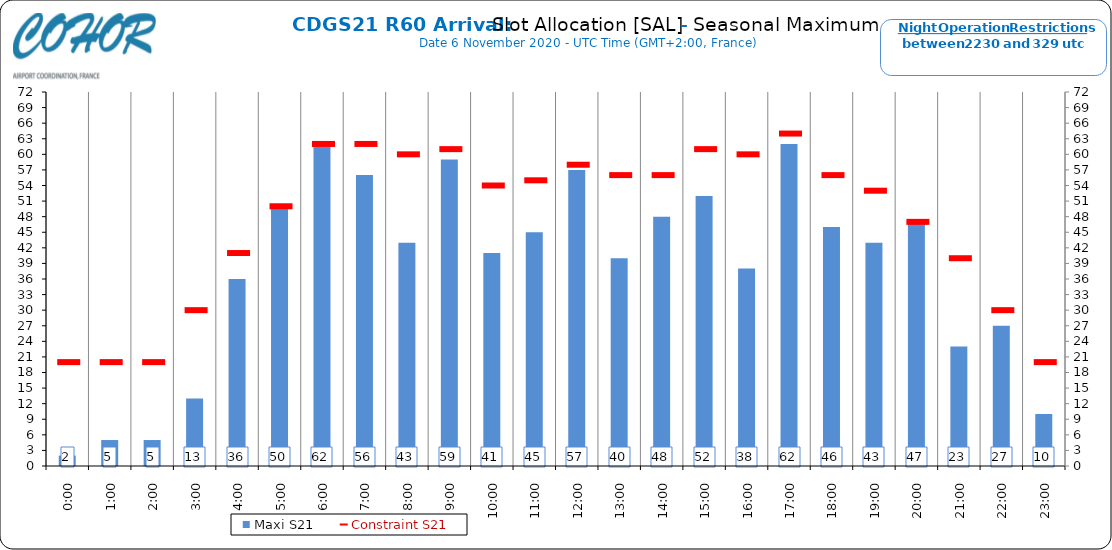
| Category | Maxi S21 |
|---|---|
| 0:00 | 2 |
| 1:00 | 5 |
| 2:00 | 5 |
| 3:00 | 13 |
| 4:00 | 36 |
| 5:00 | 50 |
| 6:00 | 62 |
| 7:00 | 56 |
| 8:00 | 43 |
| 9:00 | 59 |
| 10:00 | 41 |
| 11:00 | 45 |
| 12:00 | 57 |
| 13:00 | 40 |
| 14:00 | 48 |
| 15:00 | 52 |
| 16:00 | 38 |
| 17:00 | 62 |
| 18:00 | 46 |
| 19:00 | 43 |
| 20:00 | 47 |
| 21:00 | 23 |
| 22:00 | 27 |
| 23:00 | 10 |